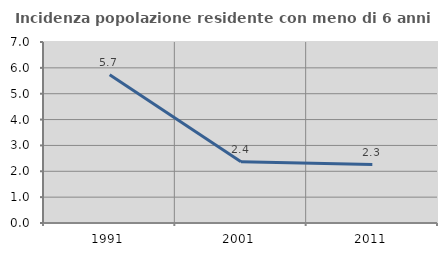
| Category | Incidenza popolazione residente con meno di 6 anni |
|---|---|
| 1991.0 | 5.732 |
| 2001.0 | 2.365 |
| 2011.0 | 2.26 |